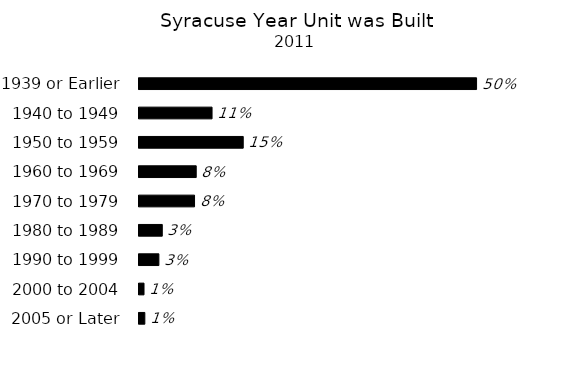
| Category | Series 0 |
|---|---|
| 2005 or Later | 0.009 |
| 2000 to 2004 | 0.007 |
| 1990 to 1999 | 0.029 |
| 1980 to 1989 | 0.034 |
| 1970 to 1979 | 0.081 |
| 1960 to 1969 | 0.084 |
| 1950 to 1959 | 0.153 |
| 1940 to 1949 | 0.107 |
| 1939 or Earlier | 0.495 |